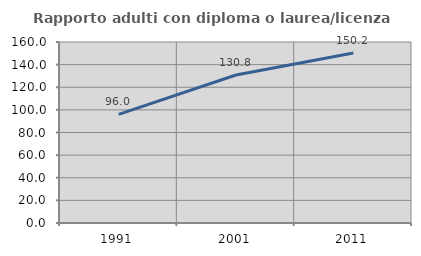
| Category | Rapporto adulti con diploma o laurea/licenza media  |
|---|---|
| 1991.0 | 96.026 |
| 2001.0 | 130.811 |
| 2011.0 | 150.242 |